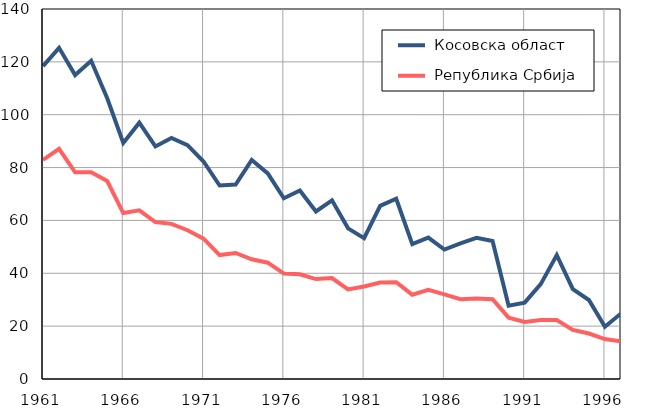
| Category |  Косовска област |  Република Србија |
|---|---|---|
| 1961.0 | 118.4 | 82.9 |
| 1962.0 | 125.3 | 87.1 |
| 1963.0 | 115 | 78.2 |
| 1964.0 | 120.4 | 78.2 |
| 1965.0 | 106.2 | 74.9 |
| 1966.0 | 89.3 | 62.8 |
| 1967.0 | 97 | 63.8 |
| 1968.0 | 88 | 59.4 |
| 1969.0 | 91.2 | 58.7 |
| 1970.0 | 88.5 | 56.3 |
| 1971.0 | 82.3 | 53.1 |
| 1972.0 | 73.2 | 46.9 |
| 1973.0 | 73.6 | 47.7 |
| 1974.0 | 82.9 | 45.3 |
| 1975.0 | 77.8 | 44 |
| 1976.0 | 68.4 | 39.9 |
| 1977.0 | 71.3 | 39.6 |
| 1978.0 | 63.4 | 37.8 |
| 1979.0 | 67.6 | 38.2 |
| 1980.0 | 57 | 33.9 |
| 1981.0 | 53.3 | 35 |
| 1982.0 | 65.5 | 36.5 |
| 1983.0 | 68.2 | 36.6 |
| 1984.0 | 51 | 31.9 |
| 1985.0 | 53.5 | 33.7 |
| 1986.0 | 49 | 32 |
| 1987.0 | 51.3 | 30.2 |
| 1988.0 | 53.4 | 30.5 |
| 1989.0 | 52.2 | 30.2 |
| 1990.0 | 27.7 | 23.2 |
| 1991.0 | 28.9 | 21.6 |
| 1992.0 | 35.9 | 22.3 |
| 1993.0 | 46.9 | 22.3 |
| 1994.0 | 34 | 18.6 |
| 1995.0 | 29.9 | 17.2 |
| 1996.0 | 19.8 | 15.1 |
| 1997.0 | 24.8 | 14.2 |